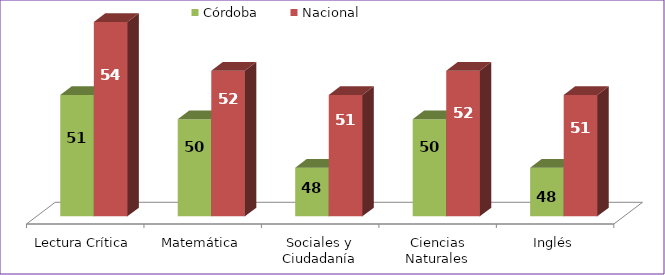
| Category | Córdoba | Nacional |
|---|---|---|
| Lectura Crítica | 51 | 54 |
| Matemática | 50 | 52 |
| Sociales y Ciudadanía | 48 | 51 |
| Ciencias Naturales | 50 | 52 |
| Inglés | 48 | 51 |